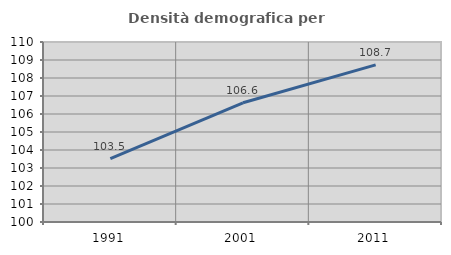
| Category | Densità demografica |
|---|---|
| 1991.0 | 103.525 |
| 2001.0 | 106.624 |
| 2011.0 | 108.732 |